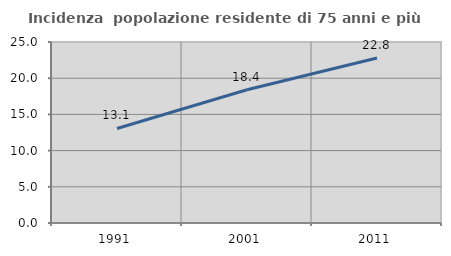
| Category | Incidenza  popolazione residente di 75 anni e più |
|---|---|
| 1991.0 | 13.057 |
| 2001.0 | 18.412 |
| 2011.0 | 22.787 |